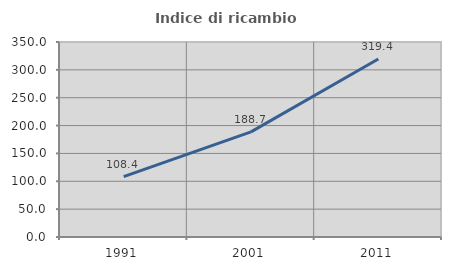
| Category | Indice di ricambio occupazionale  |
|---|---|
| 1991.0 | 108.434 |
| 2001.0 | 188.696 |
| 2011.0 | 319.444 |